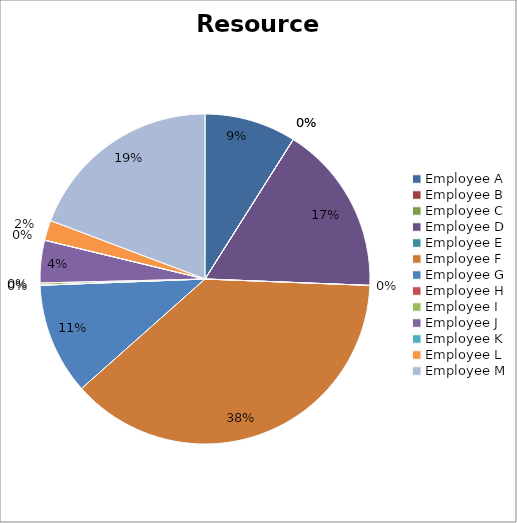
| Category | data |
|---|---|
| Employee A | 3075 |
| Employee B | 0 |
| Employee C | 0 |
| Employee D | 5700 |
| Employee E | 0 |
| Employee F | 12960 |
| Employee G | 3750 |
| Employee H | 0 |
| Employee I | 75 |
| Employee J | 1425 |
| Employee K | 0 |
| Employee L | 675 |
| Employee M | 6600 |